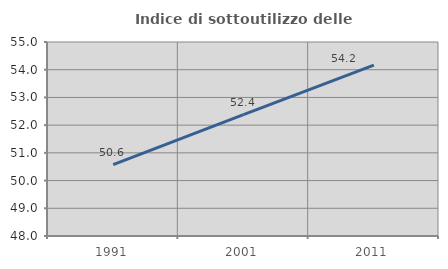
| Category | Indice di sottoutilizzo delle abitazioni  |
|---|---|
| 1991.0 | 50.575 |
| 2001.0 | 52.381 |
| 2011.0 | 54.167 |